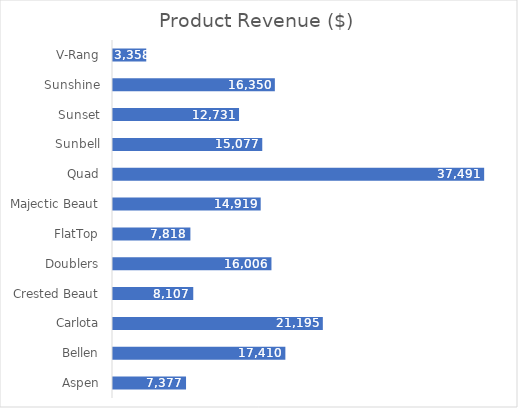
| Category | Rev ($) |
|---|---|
| Aspen | 7377.44 |
| Bellen | 17410.48 |
| Carlota | 21195.4 |
| Crested Beaut | 8107.09 |
| Doublers | 16005.6 |
| FlatTop | 7817.89 |
| Majectic Beaut | 14919.12 |
| Quad | 37490.83 |
| Sunbell | 15076.85 |
| Sunset | 12730.84 |
| Sunshine | 16349.76 |
| V-Rang | 3357.85 |